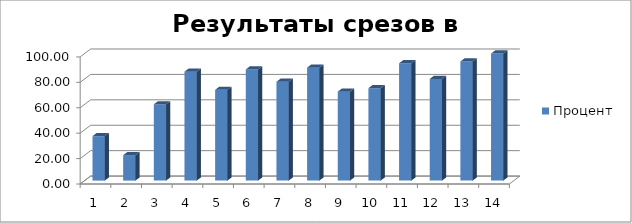
| Category | Процент |
|---|---|
| 0 | 35 |
| 1 | 20 |
| 2 | 60 |
| 3 | 85.714 |
| 4 | 71.429 |
| 5 | 87.5 |
| 6 | 77.778 |
| 7 | 88.889 |
| 8 | 70 |
| 9 | 72.727 |
| 10 | 92.308 |
| 11 | 80 |
| 12 | 93.75 |
| 13 | 100 |